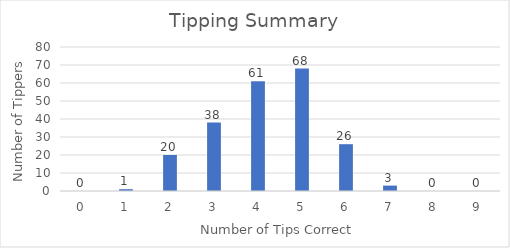
| Category | Count |
|---|---|
| 0.0 | 0 |
| 1.0 | 1 |
| 2.0 | 20 |
| 3.0 | 38 |
| 4.0 | 61 |
| 5.0 | 68 |
| 6.0 | 26 |
| 7.0 | 3 |
| 8.0 | 0 |
| 9.0 | 0 |